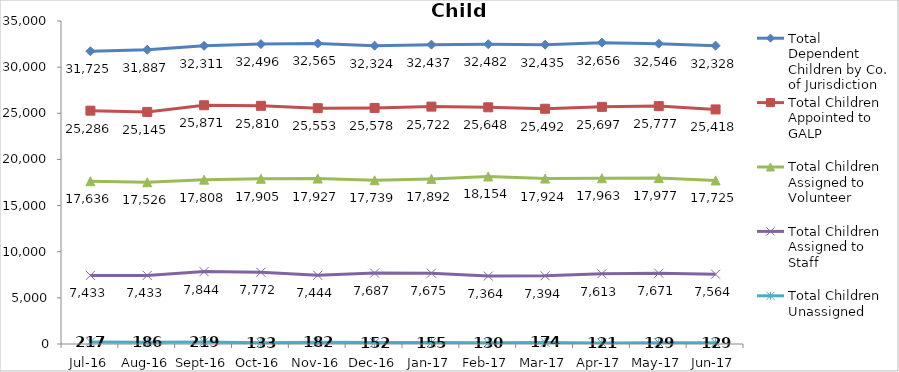
| Category | Total Dependent Children by Co. of Jurisdiction | Total Children Appointed to GALP | Total Children Assigned to Volunteer | Total Children Assigned to Staff | Total Children Unassigned |
|---|---|---|---|---|---|
| Jul-16 | 31725 | 25286 | 17636 | 7433 | 217 |
| Aug-16 | 31887 | 25145 | 17526 | 7433 | 186 |
| Sep-16 | 32311 | 25871 | 17808 | 7844 | 219 |
| Oct-16 | 32496 | 25810 | 17905 | 7772 | 133 |
| Nov-16 | 32565 | 25553 | 17927 | 7444 | 182 |
| Dec-16 | 32324 | 25578 | 17739 | 7687 | 152 |
| Jan-17 | 32437 | 25722 | 17892 | 7675 | 155 |
| Feb-17 | 32482 | 25648 | 18154 | 7364 | 130 |
| Mar-17 | 32435 | 25492 | 17924 | 7394 | 174 |
| Apr-17 | 32656 | 25697 | 17963 | 7613 | 121 |
| May-17 | 32546 | 25777 | 17977 | 7671 | 129 |
| Jun-17 | 32328 | 25418 | 17725 | 7564 | 129 |